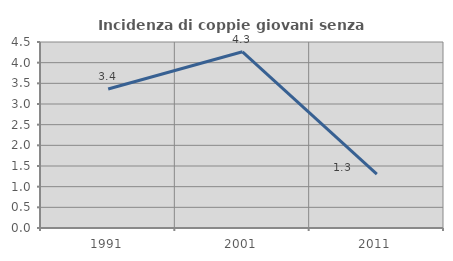
| Category | Incidenza di coppie giovani senza figli |
|---|---|
| 1991.0 | 3.361 |
| 2001.0 | 4.264 |
| 2011.0 | 1.304 |